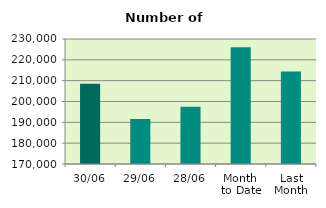
| Category | Series 0 |
|---|---|
| 30/06 | 208524 |
| 29/06 | 191588 |
| 28/06 | 197486 |
| Month 
to Date | 226069.545 |
| Last
Month | 214383.182 |